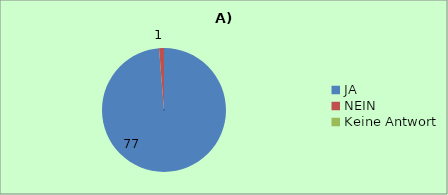
| Category | 1A | 2A | 3A | 4A |
|---|---|---|---|---|
| JA | 77 | 70 | 60 | 76 |
| NEIN | 1 | 8 | 13 | 2 |
| Keine Antwort | 0 | 0 | 5 | 0 |